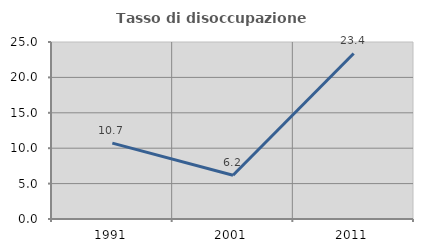
| Category | Tasso di disoccupazione giovanile  |
|---|---|
| 1991.0 | 10.714 |
| 2001.0 | 6.173 |
| 2011.0 | 23.377 |